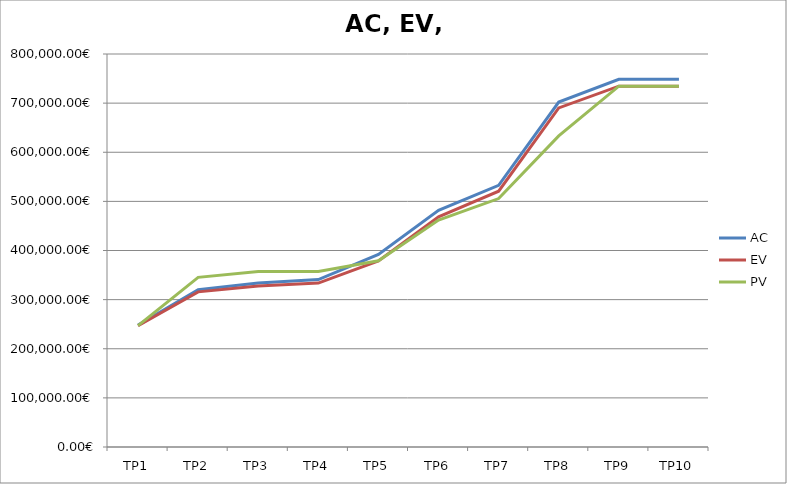
| Category | AC | EV | PV |
|---|---|---|---|
| TP1 | 248029.589 | 246956.529 | 247150.08 |
| TP2 | 320253.362 | 315841.251 | 345326.251 |
| TP3 | 333769.97 | 327855.24 | 357340.24 |
| TP4 | 340830.07 | 333752.24 | 357340.24 |
| TP5 | 392076.743 | 378854.053 | 379167.305 |
| TP6 | 481955.605 | 468618.608 | 462015.39 |
| TP7 | 532556.78 | 520649.181 | 505727.745 |
| TP8 | 702158.162 | 690277.454 | 633402.188 |
| TP9 | 748555.798 | 734602.11 | 734602.11 |
| TP10 | 748555.798 | 734602.11 | 734602.11 |